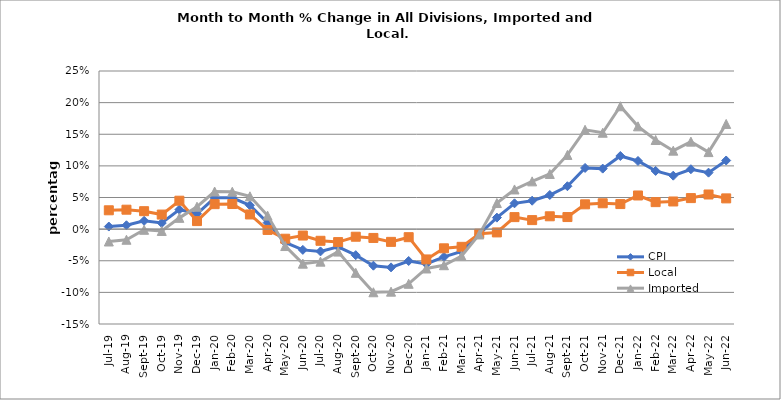
| Category | CPI | Local | Imported |
|---|---|---|---|
| 2019-07-01 | 0.004 | 0.03 | -0.02 |
| 2019-08-01 | 0.006 | 0.031 | -0.017 |
| 2019-09-01 | 0.013 | 0.028 | -0.001 |
| 2019-10-01 | 0.01 | 0.023 | -0.003 |
| 2019-11-01 | 0.031 | 0.045 | 0.018 |
| 2019-12-01 | 0.024 | 0.013 | 0.035 |
| 2020-01-01 | 0.049 | 0.039 | 0.059 |
| 2020-02-01 | 0.05 | 0.04 | 0.059 |
| 2020-03-01 | 0.038 | 0.023 | 0.052 |
| 2020-04-01 | 0.01 | -0.001 | 0.021 |
| 2020-05-01 | -0.021 | -0.015 | -0.027 |
| 2020-06-01 | -0.033 | -0.01 | -0.055 |
| 2020-07-01 | -0.035 | -0.018 | -0.051 |
| 2020-08-01 | -0.028 | -0.02 | -0.036 |
| 2020-09-01 | -0.041 | -0.012 | -0.069 |
| 2020-10-01 | -0.058 | -0.014 | -0.1 |
| 2020-11-01 | -0.06 | -0.02 | -0.099 |
| 2020-12-01 | -0.05 | -0.013 | -0.086 |
| 2021-01-01 | -0.055 | -0.048 | -0.062 |
| 2021-02-01 | -0.044 | -0.03 | -0.057 |
| 2021-03-01 | -0.035 | -0.028 | -0.043 |
| 2021-04-01 | -0.008 | -0.007 | -0.008 |
| 2021-05-01 | 0.018 | -0.005 | 0.041 |
| 2021-06-01 | 0.041 | 0.019 | 0.063 |
| 2021-07-01 | 0.045 | 0.014 | 0.075 |
| 2021-08-01 | 0.054 | 0.02 | 0.087 |
| 2021-09-01 | 0.068 | 0.019 | 0.117 |
| 2021-10-01 | 0.097 | 0.039 | 0.157 |
| 2021-11-01 | 0.096 | 0.041 | 0.152 |
| 2021-12-01 | 0.116 | 0.04 | 0.194 |
| 2022-01-01 | 0.108 | 0.053 | 0.163 |
| 2022-02-01 | 0.092 | 0.043 | 0.141 |
| 2022-03-01 | 0.085 | 0.044 | 0.124 |
| 2022-04-01 | 0.095 | 0.049 | 0.138 |
| 2022-05-01 | 0.089 | 0.055 | 0.122 |
| 2022-06-01 | 0.109 | 0.049 | 0.166 |